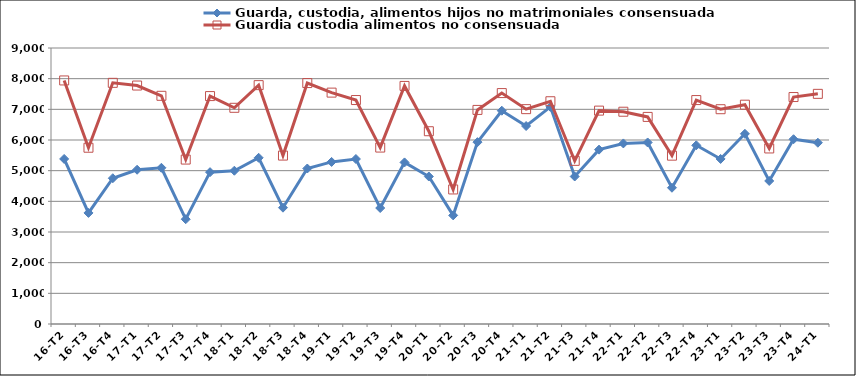
| Category | Guarda, custodia, alimentos hijos no matrimoniales consensuada | Guardia custodia alimentos no consensuada |
|---|---|---|
| 16-T2 | 5382 | 7942 |
| 16-T3 | 3622 | 5748 |
| 16-T4 | 4753 | 7864 |
| 17-T1 | 5030 | 7776 |
| 17-T2 | 5094 | 7441 |
| 17-T3 | 3417 | 5362 |
| 17-T4 | 4951 | 7432 |
| 18-T1 | 4998 | 7050 |
| 18-T2 | 5420 | 7789 |
| 18-T3 | 3793 | 5492 |
| 18-T4 | 5070 | 7857 |
| 19-T1 | 5285 | 7545 |
| 19-T2 | 5380 | 7303 |
| 19-T3 | 3782 | 5753 |
| 19-T4 | 5269 | 7763 |
| 20-T1 | 4809 | 6286 |
| 20-T2 | 3542 | 4387 |
| 20-T3 | 5930 | 6981 |
| 20-T4 | 6955 | 7530 |
| 21-T1 | 6456 | 7006 |
| 21-T2 | 7080 | 7264 |
| 21-T3 | 4810 | 5320 |
| 21-T4 | 5686 | 6958 |
| 22-T1 | 5888 | 6922 |
| 22-T2 | 5919 | 6753 |
| 22-T3 | 4443 | 5489 |
| 22-T4 | 5827 | 7302 |
| 23-T1 | 5382 | 7004 |
| 23-T2 | 6202 | 7151 |
| 23-T3 | 4664 | 5724 |
| 23-T4 | 6025 | 7401 |
| 24-T1 | 5911 | 7505 |